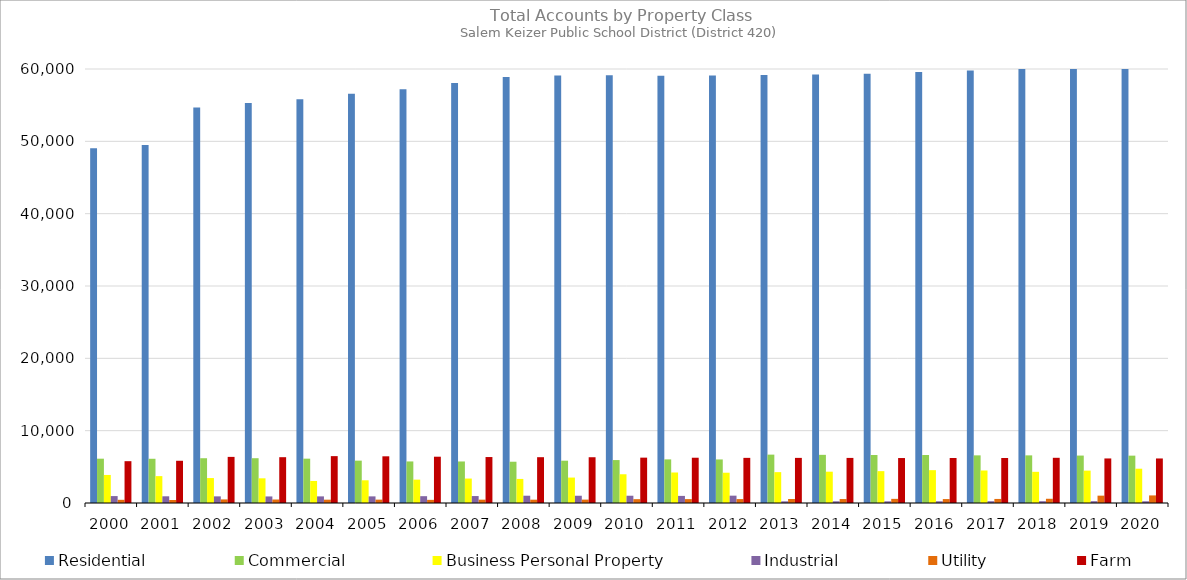
| Category | Residential | Commercial | Business Personal Property | Industrial | Utility | Farm |
|---|---|---|---|---|---|---|
| 2000.0 | 49043 | 6126 | 3878 | 956 | 441 | 5782 |
| 2001.0 | 49505 | 6114 | 3717 | 926 | 417 | 5838 |
| 2002.0 | 54691 | 6190 | 3449 | 918 | 497 | 6375 |
| 2003.0 | 55283 | 6192 | 3413 | 907 | 482 | 6333 |
| 2004.0 | 55822 | 6130 | 3048 | 915 | 460 | 6480 |
| 2005.0 | 56583 | 5857 | 3138 | 916 | 466 | 6455 |
| 2006.0 | 57213 | 5746 | 3231 | 942 | 435 | 6400 |
| 2007.0 | 58066 | 5742 | 3380 | 960 | 461 | 6354 |
| 2008.0 | 58903 | 5706 | 3329 | 1007 | 459 | 6333 |
| 2009.0 | 59111 | 5849 | 3516 | 1004 | 469 | 6327 |
| 2010.0 | 59130 | 5936 | 3974 | 1005 | 531 | 6271 |
| 2011.0 | 59084 | 6030 | 4217 | 982 | 538 | 6259 |
| 2012.0 | 59085 | 6021 | 4187 | 1014 | 541 | 6240 |
| 2013.0 | 59167 | 6687 | 4267 | 232 | 555 | 6237 |
| 2014.0 | 59247 | 6658 | 4329 | 236 | 548 | 6233 |
| 2015.0 | 59332 | 6636 | 4404 | 232 | 573 | 6216 |
| 2016.0 | 59581 | 6634 | 4541 | 237 | 544 | 6219 |
| 2017.0 | 59777 | 6587 | 4494 | 246 | 561 | 6221 |
| 2018.0 | 60008 | 6585 | 4310 | 248 | 585 | 6249 |
| 2019.0 | 60437 | 6557 | 4477 | 251 | 1015 | 6159 |
| 2020.0 | 60822 | 6547 | 4741 | 238 | 1048 | 6157 |